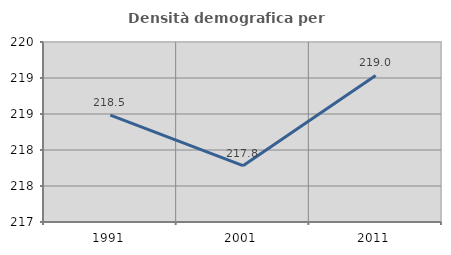
| Category | Densità demografica |
|---|---|
| 1991.0 | 218.483 |
| 2001.0 | 217.782 |
| 2011.0 | 219.036 |